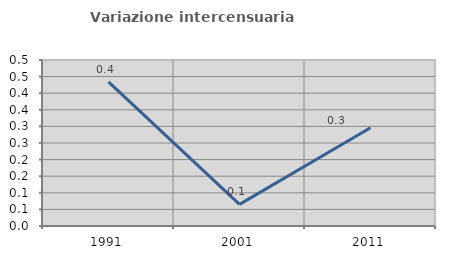
| Category | Variazione intercensuaria annua |
|---|---|
| 1991.0 | 0.434 |
| 2001.0 | 0.065 |
| 2011.0 | 0.296 |